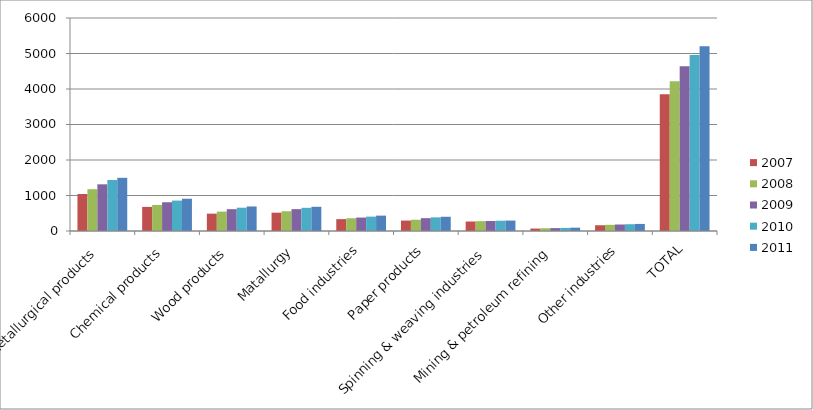
| Category | 2007 | 2008 | 2009 | 2010 | 2011 |
|---|---|---|---|---|---|
| Metallurgical products | 1042 | 1178 | 1315 | 1437 | 1498 |
| Chemical products | 679 | 734 | 810 | 857 | 909 |
| Wood products | 489 | 546 | 615 | 656 | 691 |
| Matallurgy | 516 | 557 | 616 | 653 | 682 |
| Food industries | 334 | 359 | 379 | 405 | 433 |
| Paper products | 294 | 317 | 362 | 384 | 401 |
| Spinning & weaving industries | 267 | 277 | 282 | 290 | 294 |
| Mining & petroleum refining | 69 | 77 | 82 | 87 | 94 |
| Other industries | 162 | 174 | 183 | 191 | 199 |
| TOTAL | 3852 | 4219 | 4644 | 4960 | 5201 |